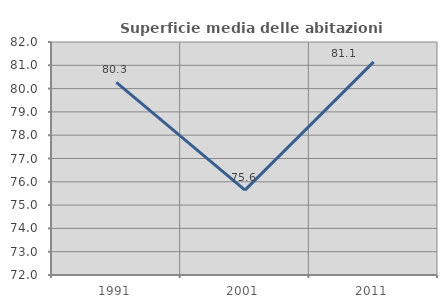
| Category | Superficie media delle abitazioni occupate |
|---|---|
| 1991.0 | 80.264 |
| 2001.0 | 75.642 |
| 2011.0 | 81.145 |